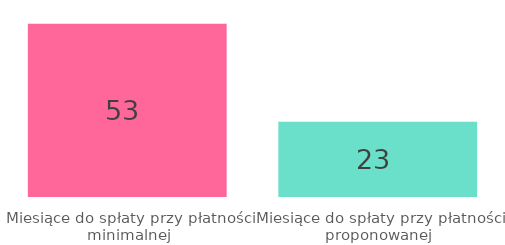
| Category | Series 0 |
|---|---|
| Miesiące do spłaty przy płatności minimalnej | 53 |
| Miesiące do spłaty przy płatności proponowanej | 23 |